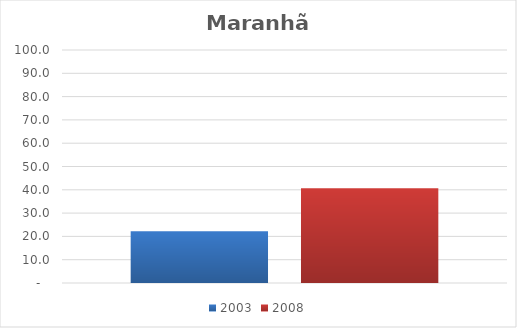
| Category | 2003 | 2008 |
|---|---|---|
| Total | 22.2 | 40.7 |